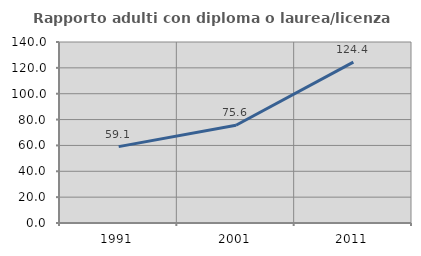
| Category | Rapporto adulti con diploma o laurea/licenza media  |
|---|---|
| 1991.0 | 59.091 |
| 2001.0 | 75.581 |
| 2011.0 | 124.39 |